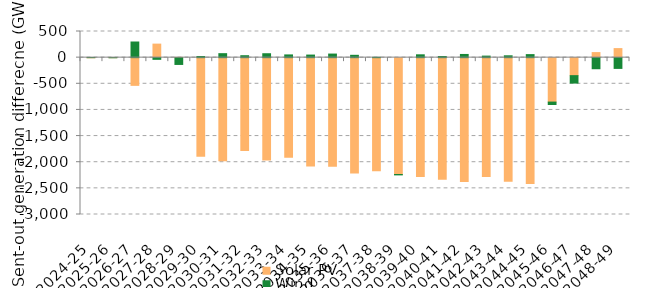
| Category | Solar PV | Wind | Offshore wind |
|---|---|---|---|
| 2024-25 | -2.793 | 1.162 | 0 |
| 2025-26 | -0.844 | -1.056 | 0 |
| 2026-27 | -530.155 | 299.117 | 0 |
| 2027-28 | 258.682 | -32.544 | 0 |
| 2028-29 | 5.036 | -130.085 | 0 |
| 2029-30 | -1884.998 | 22.292 | 0 |
| 2030-31 | -1971.194 | 75.987 | 0 |
| 2031-32 | -1775.772 | 36.954 | 0 |
| 2032-33 | -1959.757 | 74.763 | 0 |
| 2033-34 | -1902.919 | 52.22 | 0 |
| 2034-35 | -2074.4 | 49.103 | 0 |
| 2035-36 | -2077.374 | 68.46 | 0 |
| 2036-37 | -2206.346 | 44.591 | 0 |
| 2037-38 | -2161.827 | 6.118 | 0 |
| 2038-39 | -2235.153 | -7.246 | 0 |
| 2039-40 | -2273.293 | 54.148 | 0 |
| 2040-41 | -2326.628 | 21.885 | 0 |
| 2041-42 | -2366.485 | 61.033 | 0 |
| 2042-43 | -2272.756 | 29.256 | 0 |
| 2043-44 | -2365.135 | 35.341 | 0 |
| 2044-45 | -2408.532 | 57.896 | 0 |
| 2045-46 | -850.027 | -46.486 | 0 |
| 2046-47 | -344.377 | -142.117 | 0 |
| 2047-48 | 96.66 | -212.095 | 0 |
| 2048-49 | 172.918 | -205.836 | 0 |